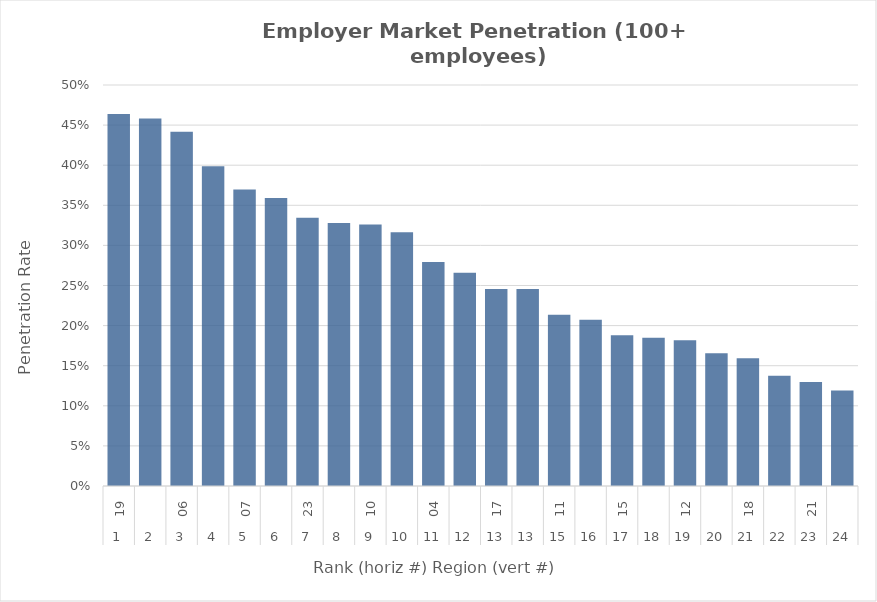
| Category | Rate |
|---|---|
| 0 | 0.464 |
| 1 | 0.458 |
| 2 | 0.442 |
| 3 | 0.399 |
| 4 | 0.37 |
| 5 | 0.359 |
| 6 | 0.334 |
| 7 | 0.328 |
| 8 | 0.326 |
| 9 | 0.316 |
| 10 | 0.279 |
| 11 | 0.266 |
| 12 | 0.246 |
| 13 | 0.246 |
| 14 | 0.213 |
| 15 | 0.207 |
| 16 | 0.188 |
| 17 | 0.185 |
| 18 | 0.182 |
| 19 | 0.166 |
| 20 | 0.159 |
| 21 | 0.137 |
| 22 | 0.13 |
| 23 | 0.119 |